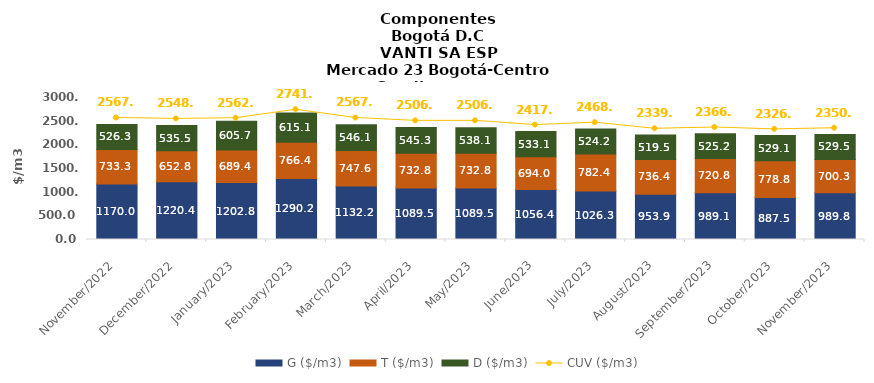
| Category | G ($/m3) | T ($/m3) | D ($/m3) |
|---|---|---|---|
| 2022-11-01 | 1169.95 | 733.29 | 526.27 |
| 2022-12-01 | 1220.44 | 652.77 | 535.5 |
| 2023-01-01 | 1202.77 | 689.37 | 605.73 |
| 2023-02-01 | 1290.19 | 766.35 | 615.06 |
| 2023-03-01 | 1132.24 | 747.55 | 546.05 |
| 2023-04-01 | 1089.52 | 732.84 | 545.26 |
| 2023-05-01 | 1089.52 | 732.84 | 538.11 |
| 2023-06-01 | 1056.38 | 694.03 | 533.13 |
| 2023-07-01 | 1026.28 | 782.44 | 524.19 |
| 2023-08-01 | 953.86 | 736.37 | 519.49 |
| 2023-09-01 | 989.12 | 720.82 | 525.15 |
| 2023-10-01 | 887.54 | 778.8 | 529.13 |
| 2023-11-01 | 989.81 | 700.33 | 529.5 |